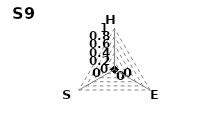
| Category | 0 |
|---|---|
| H | 0 |
| E | 0 |
| S | 0 |